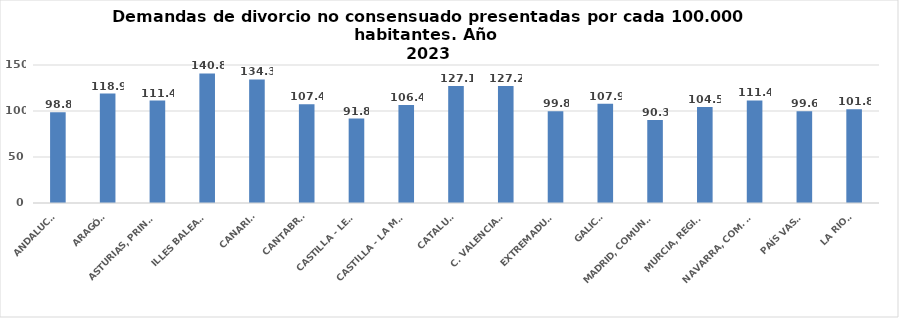
| Category | Series 0 |
|---|---|
| ANDALUCÍA | 98.763 |
| ARAGÓN | 118.948 |
| ASTURIAS, PRINCIPADO | 111.364 |
| ILLES BALEARS | 140.794 |
| CANARIAS | 134.348 |
| CANTABRIA | 107.386 |
| CASTILLA - LEÓN | 91.792 |
| CASTILLA - LA MANCHA | 106.41 |
| CATALUÑA | 127.104 |
| C. VALENCIANA | 127.169 |
| EXTREMADURA | 99.781 |
| GALICIA | 107.863 |
| MADRID, COMUNIDAD | 90.291 |
| MURCIA, REGIÓN | 104.464 |
| NAVARRA, COM. FORAL | 111.425 |
| PAÍS VASCO | 99.644 |
| LA RIOJA | 101.78 |